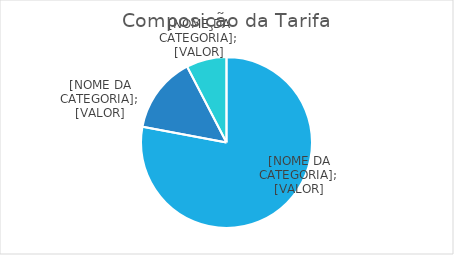
| Category | Series 0 |
|---|---|
| Tarifa P0 Água+Esgoto (TB) | 0.779 |
| Tarifa Parcela A (TA) | 0.144 |
| Compensações | 0.076 |